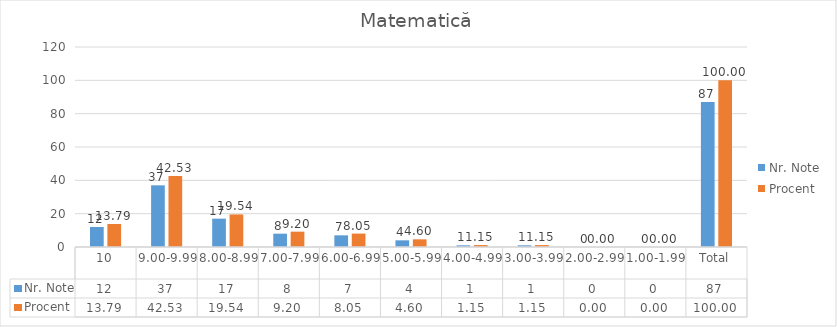
| Category | Nr. Note | Procent |
|---|---|---|
| 10 | 12 | 13.793 |
| 9.00-9.99 | 37 | 42.529 |
| 8.00-8.99 | 17 | 19.54 |
| 7.00-7.99 | 8 | 9.195 |
| 6.00-6.99 | 7 | 8.046 |
| 5.00-5.99 | 4 | 4.598 |
| 4.00-4.99 | 1 | 1.149 |
| 3.00-3.99 | 1 | 1.149 |
| 2.00-2.99 | 0 | 0 |
| 1.00-1.99 | 0 | 0 |
| Total | 87 | 100 |